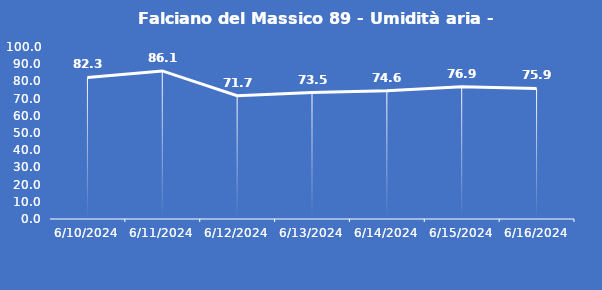
| Category | Falciano del Massico 89 - Umidità aria - Grezzo (%) |
|---|---|
| 6/10/24 | 82.3 |
| 6/11/24 | 86.1 |
| 6/12/24 | 71.7 |
| 6/13/24 | 73.5 |
| 6/14/24 | 74.6 |
| 6/15/24 | 76.9 |
| 6/16/24 | 75.9 |